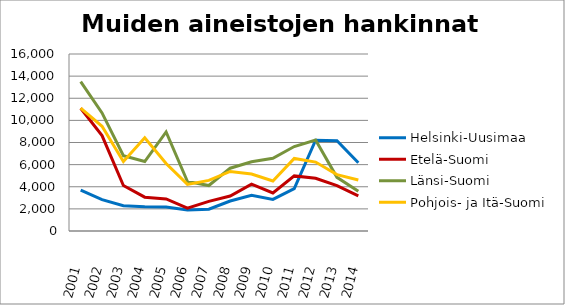
| Category | Helsinki-Uusimaa | Etelä-Suomi | Länsi-Suomi | Pohjois- ja Itä-Suomi |
|---|---|---|---|---|
| 2001.0 | 3698 | 11098 | 13497 | 11109 |
| 2002.0 | 2831 | 8628 | 10675 | 9466 |
| 2003.0 | 2278 | 4108 | 6807 | 6282 |
| 2004.0 | 2186 | 3059 | 6277 | 8434 |
| 2005.0 | 2160 | 2901 | 8951 | 6105 |
| 2006.0 | 1909 | 2069 | 4474 | 4215 |
| 2007.0 | 1971 | 2676 | 4110 | 4577 |
| 2008.0 | 2710 | 3159 | 5677 | 5383 |
| 2009.0 | 3228 | 4228 | 6252 | 5155 |
| 2010.0 | 2855 | 3437 | 6571 | 4523 |
| 2011.0 | 3833 | 4979 | 7636 | 6557 |
| 2012.0 | 8212 | 4762 | 8227 | 6232 |
| 2013.0 | 8167 | 4096 | 4849 | 5100 |
| 2014.0 | 6172 | 3182 | 3583 | 4609 |